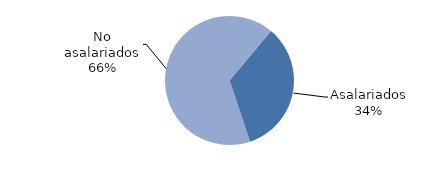
| Category | informales |
|---|---|
| Asalariados | 448.351 |
| No asalariados | 880.009 |